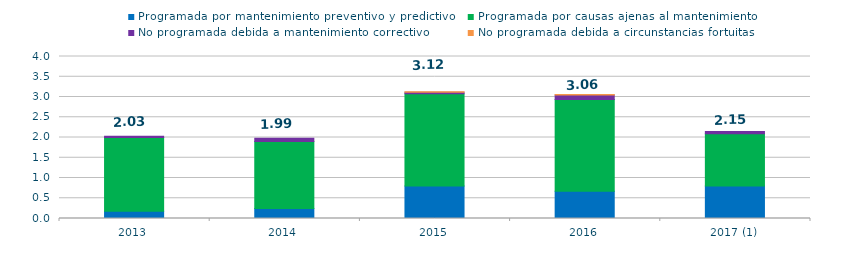
| Category | Programada por mantenimiento preventivo y predictivo | Programada por causas ajenas al mantenimiento  | No programada debida a mantenimiento correctivo  | No programada debida a circunstancias fortuitas  |
|---|---|---|---|---|
| 2013 | 0.18 | 1.82 | 0.03 | 0 |
| 2014 | 0.25 | 1.65 | 0.08 | 0 |
| 2015 | 0.8 | 2.28 | 0.04 | 0.01 |
| 2016 | 0.67 | 2.27 | 0.11 | 0.01 |
| 2017 (1) | 0.8 | 1.29 | 0.06 | 0 |